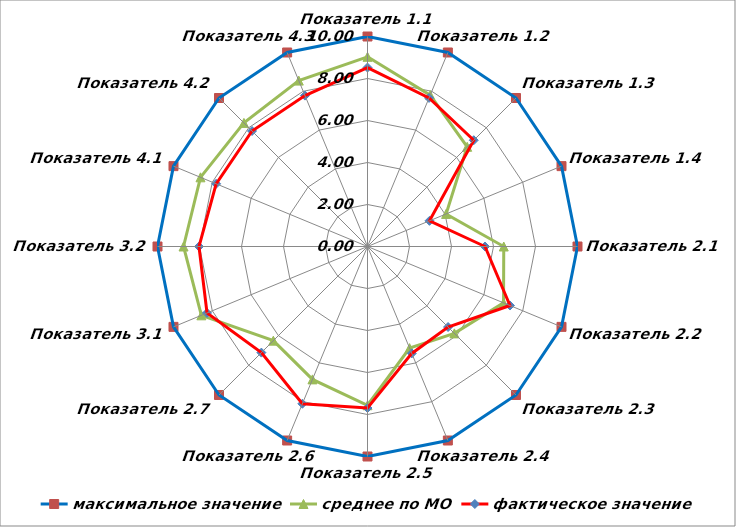
| Category | максимальное значение | среднее по МО | фактическое значение |
|---|---|---|---|
| Показатель 1.1 | 10 | 9.033 | 8.522 |
| Показатель 1.2 | 10 | 7.803 | 7.657 |
| Показатель 1.3 | 10 | 6.713 | 7.156 |
| Показатель 1.4 | 10 | 4.051 | 3.194 |
| Показатель 2.1 | 10 | 6.489 | 5.595 |
| Показатель 2.2 | 10 | 7.011 | 7.344 |
| Показатель 2.3 | 10 | 5.851 | 5.424 |
| Показатель 2.4 | 10 | 5.239 | 5.511 |
| Показатель 2.5 | 10 | 7.56 | 7.69 |
| Показатель 2.6 | 10 | 6.849 | 8.106 |
| Показатель 2.7 | 10 | 6.342 | 7.146 |
| Показатель 3.1 | 10 | 8.563 | 8.272 |
| Показатель 3.2 | 10 | 8.76 | 8.025 |
| Показатель 4.1 | 10 | 8.608 | 7.801 |
| Показатель 4.2 | 10 | 8.323 | 7.778 |
| Показатель 4.3 | 10 | 8.551 | 7.778 |